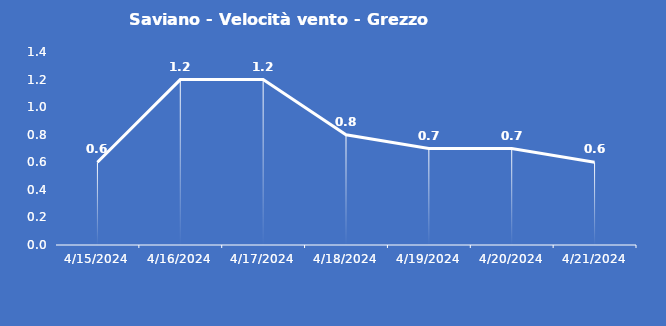
| Category | Saviano - Velocità vento - Grezzo (m/s) |
|---|---|
| 4/15/24 | 0.6 |
| 4/16/24 | 1.2 |
| 4/17/24 | 1.2 |
| 4/18/24 | 0.8 |
| 4/19/24 | 0.7 |
| 4/20/24 | 0.7 |
| 4/21/24 | 0.6 |